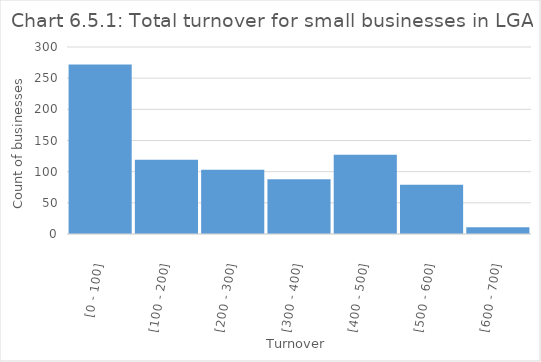
| Category | Series 0 |
|---|---|
| [0 - 100] | 272 |
| [100 - 200] | 119 |
| [200 - 300] | 103 |
| [300 - 400] | 88 |
| [400 - 500] | 127 |
| [500 - 600] | 79 |
| [600 - 700] | 11 |